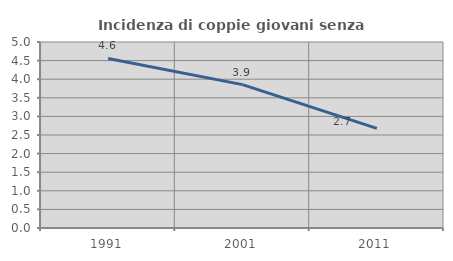
| Category | Incidenza di coppie giovani senza figli |
|---|---|
| 1991.0 | 4.557 |
| 2001.0 | 3.854 |
| 2011.0 | 2.678 |